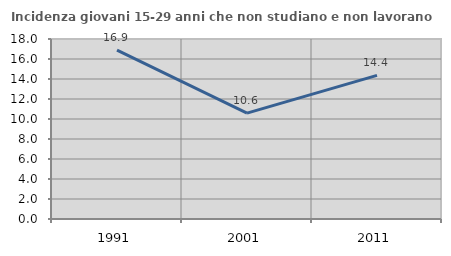
| Category | Incidenza giovani 15-29 anni che non studiano e non lavorano  |
|---|---|
| 1991.0 | 16.887 |
| 2001.0 | 10.583 |
| 2011.0 | 14.36 |